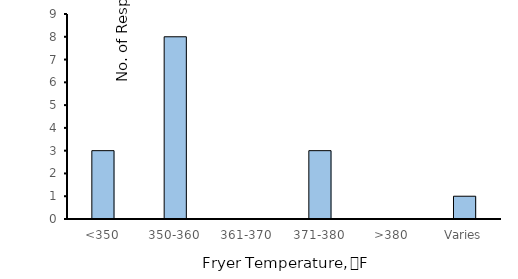
| Category | Series 0 |
|---|---|
| <350 | 3 |
| 350-360 | 8 |
| 361-370 | 0 |
| 371-380 | 3 |
| >380 | 0 |
| Varies | 1 |